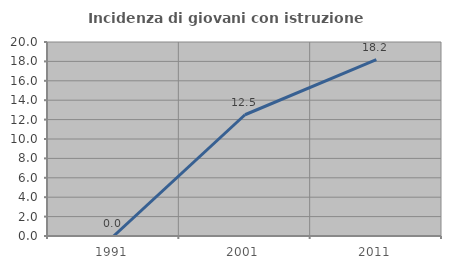
| Category | Incidenza di giovani con istruzione universitaria |
|---|---|
| 1991.0 | 0 |
| 2001.0 | 12.5 |
| 2011.0 | 18.182 |